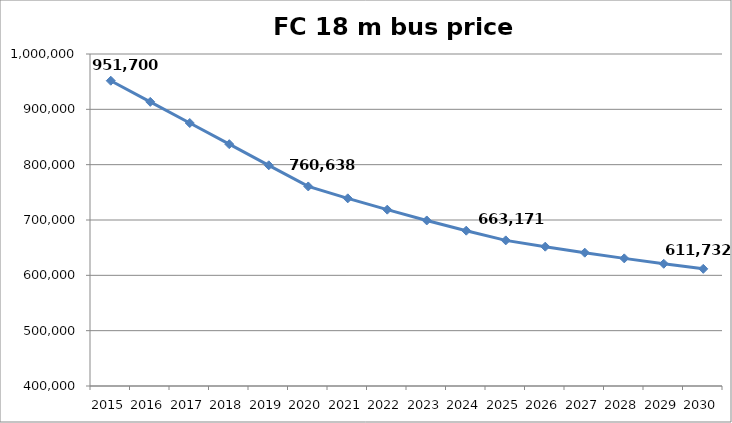
| Category | FC bus price |
|---|---|
| 2015.0 | 951700 |
| 2016.0 | 913487.654 |
| 2017.0 | 875275.309 |
| 2018.0 | 837062.963 |
| 2019.0 | 798850.618 |
| 2020.0 | 760638.272 |
| 2021.0 | 739156.672 |
| 2022.0 | 718669.165 |
| 2023.0 | 699175.749 |
| 2024.0 | 680676.426 |
| 2025.0 | 663171.195 |
| 2026.0 | 651776.827 |
| 2027.0 | 640935.752 |
| 2028.0 | 630647.971 |
| 2029.0 | 620913.483 |
| 2030.0 | 611732.289 |